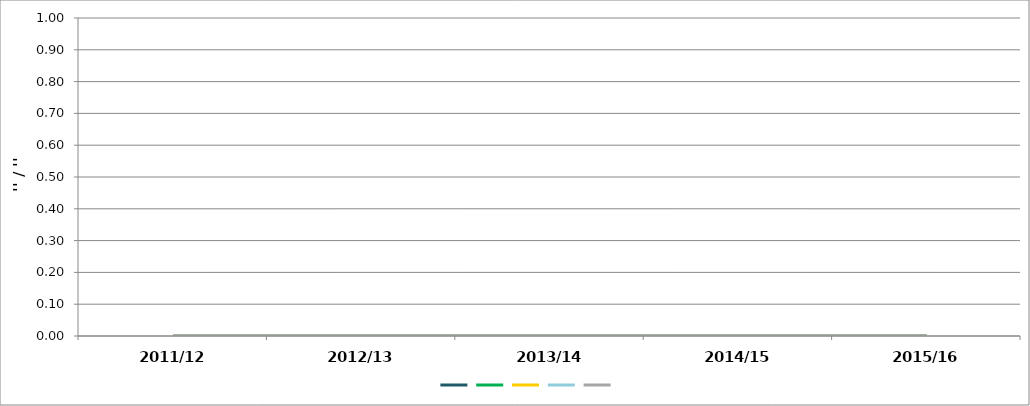
| Category | Series 1 | Series 2 | Series 0 | Series 3 | Series 4 |
|---|---|---|---|---|---|
| 2011/12 | 0 | 0 | 0 | 0 | 0 |
| 2012/13 | 0 | 0 | 0 | 0 | 0 |
| 2013/14 | 0 | 0 | 0 | 0 | 0 |
| 2014/15 | 0 | 0 | 0 | 0 | 0 |
| 2015/16 | 0 | 0 | 0 | 0 | 0 |